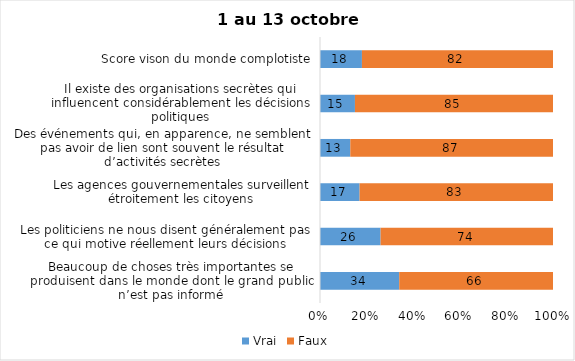
| Category | Vrai | Faux |
|---|---|---|
| Beaucoup de choses très importantes se produisent dans le monde dont le grand public n’est pas informé | 34 | 66 |
| Les politiciens ne nous disent généralement pas ce qui motive réellement leurs décisions | 26 | 74 |
| Les agences gouvernementales surveillent étroitement les citoyens | 17 | 83 |
| Des événements qui, en apparence, ne semblent pas avoir de lien sont souvent le résultat d’activités secrètes | 13 | 87 |
| Il existe des organisations secrètes qui influencent considérablement les décisions politiques | 15 | 85 |
| Score vison du monde complotiste | 18 | 82 |